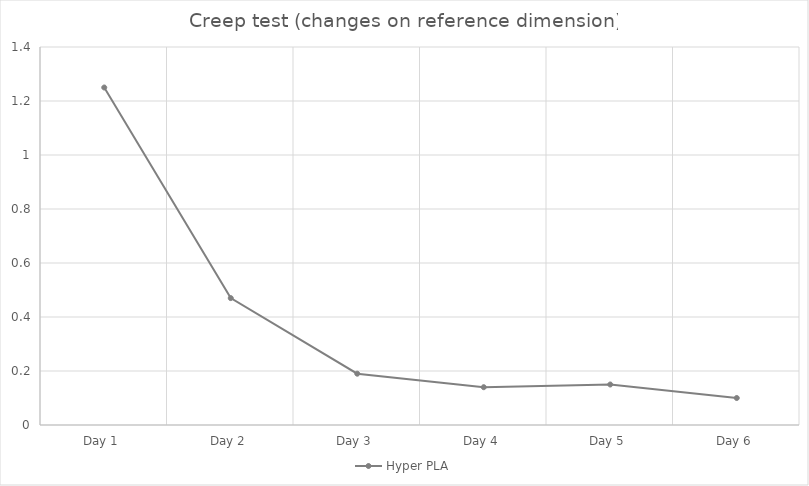
| Category | Hyper PLA |
|---|---|
| Day 1 | 1.25 |
| Day 2 | 0.47 |
| Day 3 | 0.19 |
| Day 4 | 0.14 |
| Day 5 | 0.15 |
| Day 6 | 0.1 |